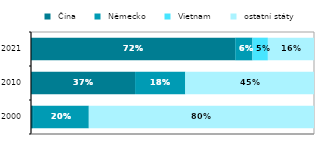
| Category |  Čína |  Německo |  Vietnam |  ostatní státy |
|---|---|---|---|---|
| 2000.0 | 0.007 | 0.197 | 0 | 0.796 |
| 2010.0 | 0.368 | 0.177 | 0.001 | 0.454 |
| 2021.0 | 0.722 | 0.061 | 0.054 | 0.163 |